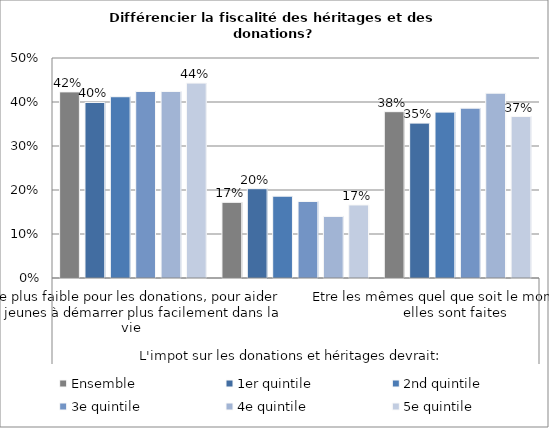
| Category | Ensemble | 1er quintile | 2nd quintile | 3e quintile | 4e quintile | 5e quintile |
|---|---|---|---|---|---|---|
| 0 | 0.423 | 0.399 | 0.412 | 0.424 | 0.424 | 0.443 |
| 1 | 0.172 | 0.203 | 0.186 | 0.174 | 0.14 | 0.166 |
| 2 | 0.378 | 0.352 | 0.377 | 0.386 | 0.42 | 0.367 |